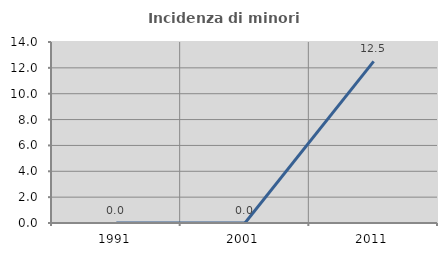
| Category | Incidenza di minori stranieri |
|---|---|
| 1991.0 | 0 |
| 2001.0 | 0 |
| 2011.0 | 12.5 |